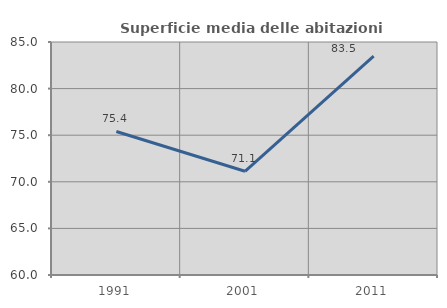
| Category | Superficie media delle abitazioni occupate |
|---|---|
| 1991.0 | 75.402 |
| 2001.0 | 71.127 |
| 2011.0 | 83.485 |